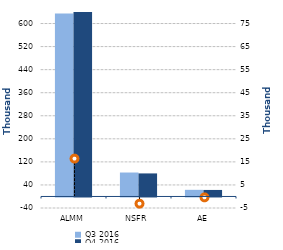
| Category | Q3 2016 | Q4 2016 |
|---|---|---|
| 0 | 634401 | 650820 |
| 1/1/00 | 83098 | 79977 |
| 1/2/00 | 23038 | 22650 |